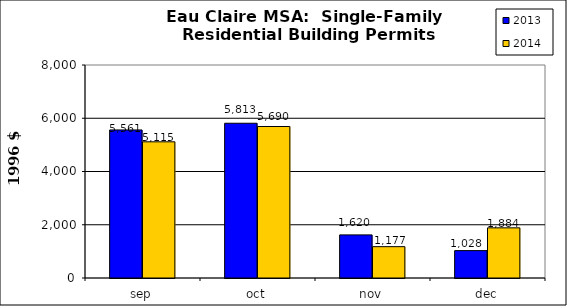
| Category | 2013 | 2014 |
|---|---|---|
| sep | 5560.593 | 5115.006 |
| oct | 5812.582 | 5690.098 |
| nov | 1619.628 | 1176.702 |
| dec | 1028.475 | 1883.555 |